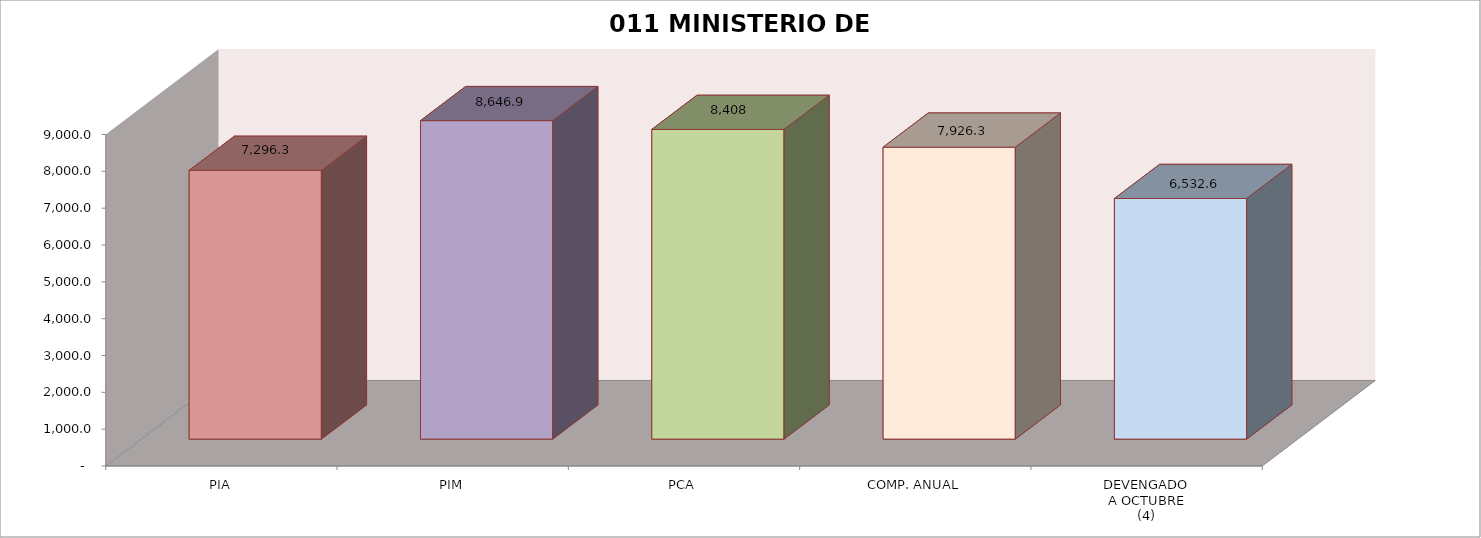
| Category | 011 MINISTERIO DE SALUD |
|---|---|
| PIA | 7296.309 |
| PIM | 8646.915 |
| PCA | 8408.328 |
| COMP. ANUAL | 7926.286 |
| DEVENGADO
A OCTUBRE
(4) | 6532.635 |